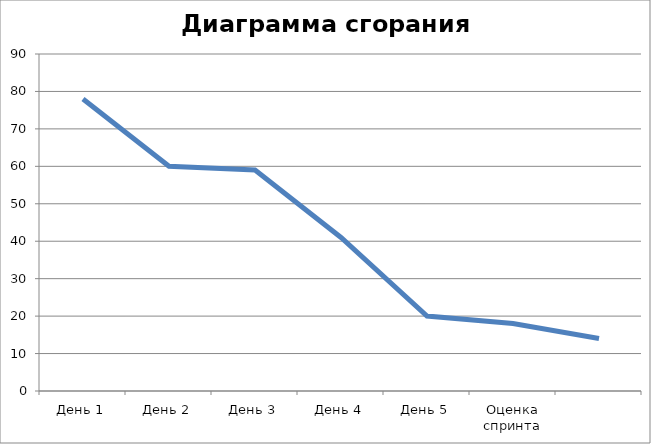
| Category | Sprint Burndown Chart |
|---|---|
| День 1 | 78 |
| День 2 | 60 |
| День 3 | 59 |
| День 4 | 41 |
| День 5 | 20 |
| Оценка спринта | 18 |